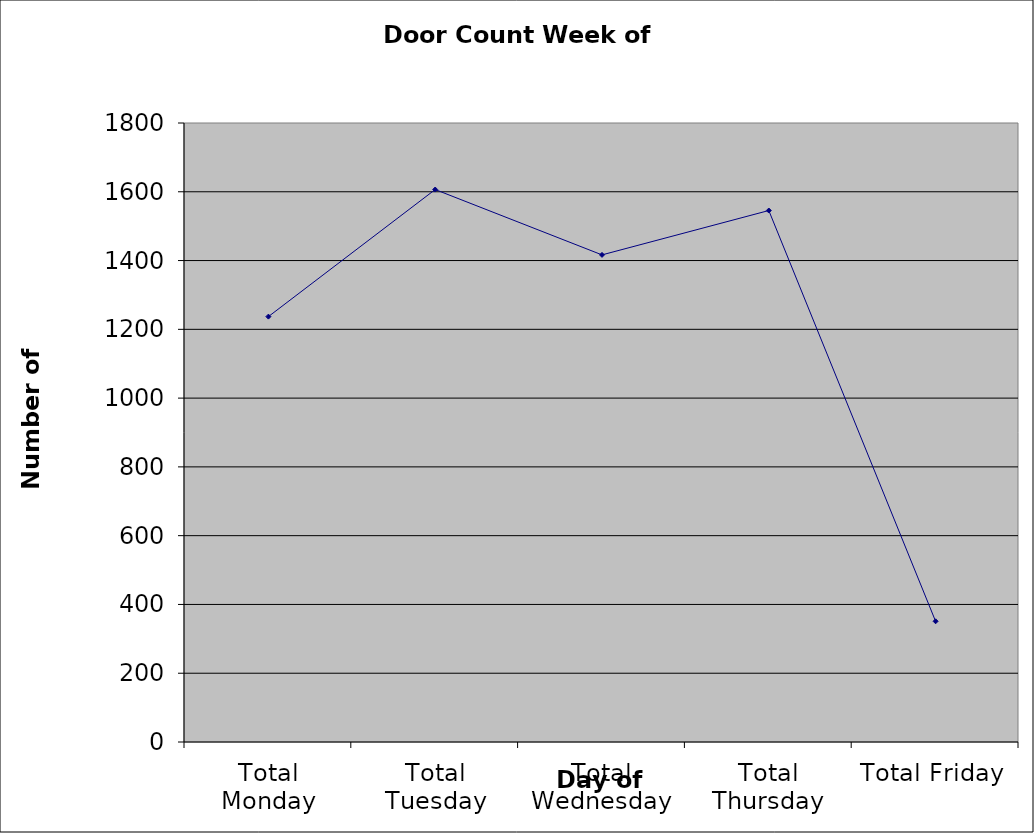
| Category | Series 0 |
|---|---|
| Total Monday | 1237 |
| Total Tuesday | 1606.5 |
| Total Wednesday | 1416.5 |
| Total Thursday | 1545.5 |
| Total Friday | 351 |